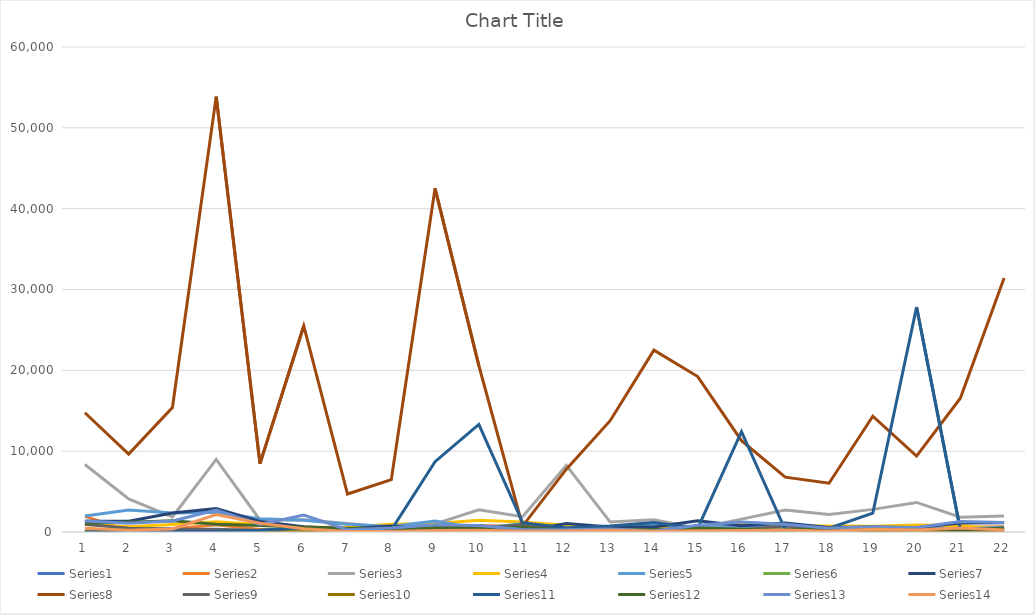
| Category | Series 0 | Series 1 | Series 2 | Series 3 | Series 4 | Series 5 | Series 6 | Series 7 | Series 8 | Series 9 | Series 10 | Series 11 | Series 12 | Series 13 |
|---|---|---|---|---|---|---|---|---|---|---|---|---|---|---|
| 0 | 0 | 1939 | 8345 | 939 | 1967 | 51 | 1322 | 14753 | 945 | 92 | 0 | 1122 | 1369 | 468 |
| 1 | 452 | 203 | 4089 | 647 | 2731 | 63 | 1331 | 9648 | 451 | 37 | 31 | 1213 | 1080 | 214 |
| 2 | 375 | 374 | 1862 | 937 | 2348 | 50 | 2355 | 15395 | 326 | 41 | 48 | 1379 | 1373 | 368 |
| 3 | 132 | 903 | 8978 | 1271 | 2439 | 42 | 2897 | 53861 | 328 | 37 | 57 | 947 | 2720 | 2148 |
| 4 | 309 | 314 | 1495 | 917 | 1632 | 54 | 1310 | 8461 | 188 | 15 | 214 | 793 | 939 | 1079 |
| 5 | 200 | 216 | 1529 | 591 | 1466 | 31 | 643 | 25491 | 528 | 9 | 512 | 574 | 2100 | 405 |
| 6 | 15 | 74 | 1056 | 606 | 952 | 38 | 389 | 4695 | 48 | 6 | 362 | 453 | 287 | 74 |
| 7 | 12 | 24 | 546 | 945 | 689 | 24 | 744 | 6478 | 47 | 12 | 254 | 354 | 494 | 59 |
| 8 | 22 | 93 | 1003 | 1038 | 1347 | 35 | 259 | 42514 | 272 | 33 | 8698 | 551 | 908 | 174 |
| 9 | 380 | 813 | 2744 | 1449 | 395 | 51 | 800 | 20598 | 484 | 63 | 13304 | 550 | 800 | 227 |
| 10 | 72 | 685 | 1890 | 1252 | 1046 | 56 | 56 | 735 | 896 | 172 | 1157 | 582 | 323 | 99 |
| 11 | 28 | 375 | 8250 | 836 | 533 | 56 | 1039 | 7778 | 385 | 48 | 502 | 208 | 271 | 118 |
| 12 | 27 | 326 | 1227 | 404 | 558 | 36 | 619 | 13772 | 188 | 34 | 733 | 241 | 357 | 220 |
| 13 | 15 | 243 | 1515 | 428 | 860 | 43 | 622 | 22497 | 40 | 18 | 1180 | 323 | 126 | 108 |
| 14 | 20 | 338 | 482 | 700 | 607 | 43 | 1378 | 19229 | 185 | 54 | 439 | 501 | 834 | 146 |
| 15 | 28 | 684 | 1596 | 942 | 709 | 70 | 781 | 11303 | 241 | 51 | 12402 | 352 | 1244 | 188 |
| 16 | 8 | 939 | 2712 | 754 | 574 | 61 | 1120 | 6789 | 778 | 15 | 277 | 238 | 955 | 241 |
| 17 | 2 | 587 | 2173 | 730 | 512 | 62 | 559 | 6037 | 187 | 15 | 472 | 466 | 466 | 97 |
| 18 | 30 | 479 | 2800 | 706 | 571 | 48 | 613 | 14323 | 184 | 76 | 2323 | 438 | 640 | 342 |
| 19 | 6 | 201 | 3659 | 867 | 557 | 49 | 538 | 9383 | 81 | 38 | 27825 | 397 | 561 | 258 |
| 20 | 2 | 593 | 1838 | 800 | 381 | 97 | 1113 | 16547 | 160 | 48 | 297 | 213 | 1288 | 506 |
| 21 | 0 | 643 | 1985 | 298 | 602 | 82 | 1159 | 31421 | 199 | 83 | 354 | 486 | 1166 | 241 |